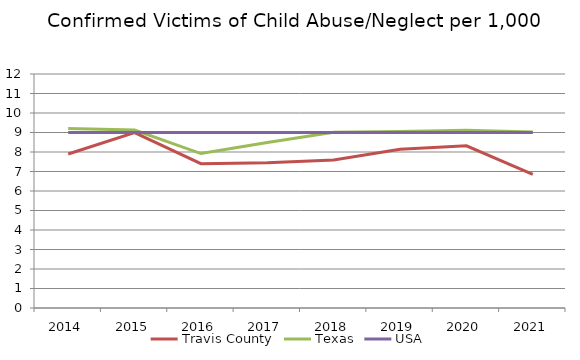
| Category | Travis County | Texas | USA |
|---|---|---|---|
| 2014.0 | 7.9 | 9.2 | 9 |
| 2015.0 | 8.99 | 9.13 | 9 |
| 2016.0 | 7.4 | 7.92 | 9 |
| 2017.0 | 7.45 | 8.49 | 9 |
| 2018.0 | 7.59 | 9.01 | 9 |
| 2019.0 | 8.14 | 9.05 | 9 |
| 2020.0 | 8.32 | 9.11 | 9 |
| 2021.0 | 6.85 | 9.02 | 9 |